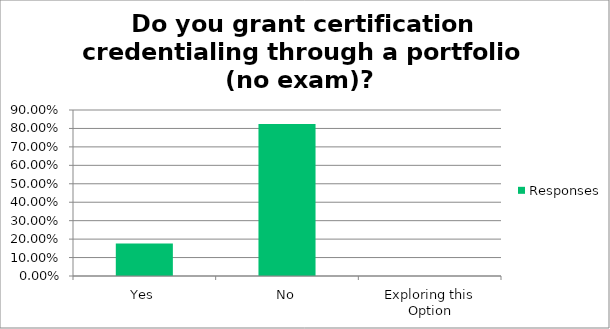
| Category | Responses |
|---|---|
| Yes | 0.176 |
| No | 0.823 |
| Exploring this Option | 0 |